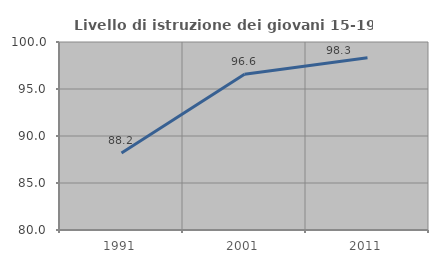
| Category | Livello di istruzione dei giovani 15-19 anni |
|---|---|
| 1991.0 | 88.193 |
| 2001.0 | 96.559 |
| 2011.0 | 98.317 |